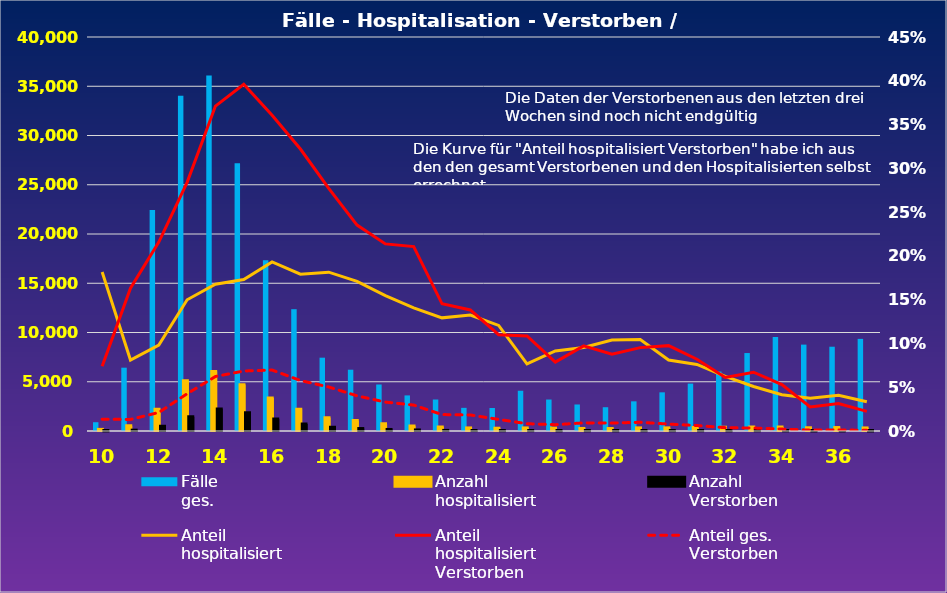
| Category | Fälle
ges. | Anzahl
hospitalisiert | Anzahl
Verstorben |
|---|---|---|---|
| 10.0 | 892 | 162 | 12 |
| 11.0 | 6428 | 521 | 85 |
| 12.0 | 22438 | 2201 | 475 |
| 13.0 | 34027 | 5099 | 1448 |
| 14.0 | 36090 | 6052 | 2246 |
| 15.0 | 27176 | 4702 | 1862 |
| 16.0 | 17338 | 3347 | 1207 |
| 17.0 | 12366 | 2214 | 713 |
| 18.0 | 7442 | 1350 | 374 |
| 19.0 | 6222 | 1063 | 250 |
| 20.0 | 4722 | 730 | 156 |
| 21.0 | 3612 | 508 | 107 |
| 22.0 | 3196 | 413 | 60 |
| 23.0 | 2350 | 311 | 43 |
| 24.0 | 2338 | 282 | 31 |
| 25.0 | 4086 | 313 | 34 |
| 26.0 | 3195 | 292 | 23 |
| 27.0 | 2692 | 257 | 25 |
| 28.0 | 2414 | 251 | 22 |
| 29.0 | 3012 | 315 | 30 |
| 30.0 | 3925 | 318 | 31 |
| 31.0 | 4812 | 366 | 30 |
| 32.0 | 6033 | 376 | 23 |
| 33.0 | 7914 | 402 | 27 |
| 34.0 | 9546 | 396 | 21 |
| 35.0 | 8770 | 328 | 9 |
| 36.0 | 8556 | 350 | 11 |
| 37.0 | 9352 | 312 | 7 |